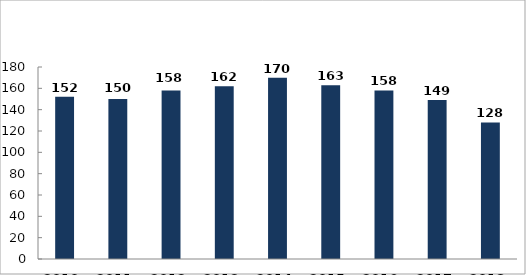
| Category | Súlyos sérüléses közúti közlekedési balesetek |
|---|---|
| 2010. év | 152 |
| 2011. év | 150 |
| 2012. év | 158 |
| 2013. év | 162 |
| 2014. év | 170 |
| 2015. év | 163 |
| 2016. év | 158 |
| 2017. év | 149 |
| 2018. év | 128 |